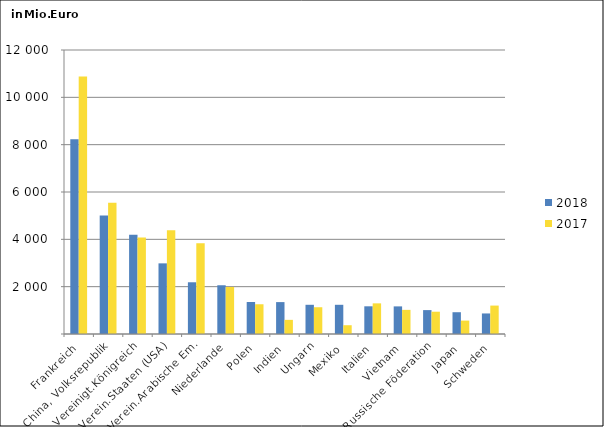
| Category | 2018 | 2017 |
|---|---|---|
| Frankreich | 8228.17 | 10877.158 |
| China, Volksrepublik | 5003.969 | 5546.894 |
| Vereinigt.Königreich | 4195.215 | 4075.323 |
| Verein.Staaten (USA) | 2984.837 | 4384.761 |
| Verein.Arabische Em. | 2185.879 | 3835.478 |
| Niederlande | 2059.574 | 1987.647 |
| Polen | 1351.06 | 1256.947 |
| Indien | 1347.856 | 597.417 |
| Ungarn | 1234.277 | 1130.893 |
| Mexiko | 1234.067 | 371.008 |
| Italien | 1170.2 | 1294.719 |
| Vietnam | 1166.814 | 1019.664 |
| Russische Föderation | 1009.62 | 941.811 |
| Japan | 920.417 | 566.579 |
| Schweden | 868.231 | 1201.033 |